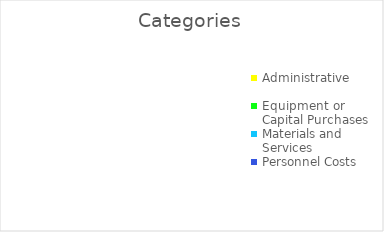
| Category | Series 0 |
|---|---|
| Administrative | 0 |
| Equipment or Capital Purchases | 0 |
| Materials and Services | 0 |
| Personnel Costs | 0 |